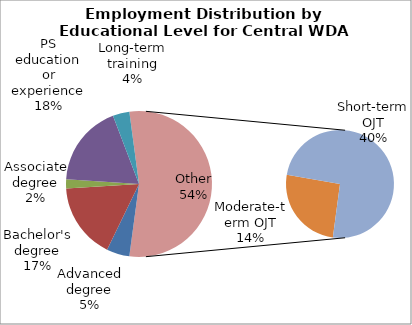
| Category | Series 0 |
|---|---|
| Advanced degree | 14110 |
| Bachelor's degree | 46610 |
| Associate degree | 5550 |
| PS education or experience | 50260 |
| Long-term training | 10220 |
| Moderate-term OJT | 38530 |
| Short-term OJT | 111630 |